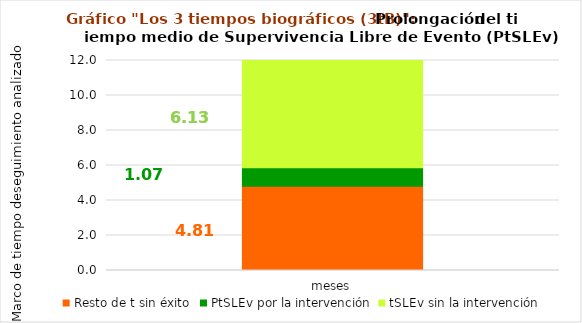
| Category | Resto de t sin éxito | PtSLEv por la intervención | tSLEv sin la intervención |
|---|---|---|---|
| meses | 4.808 | 1.066 | 6.127 |